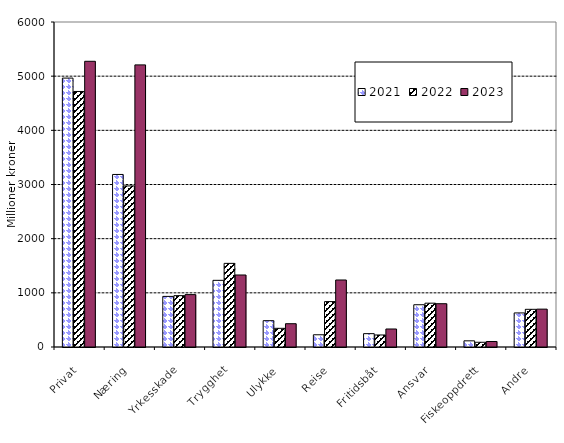
| Category | 2021 | 2022 | 2023 |
|---|---|---|---|
| Privat | 4964.318 | 4717.422 | 5274.66 |
| Næring | 3185.211 | 2973.657 | 5208.194 |
| Yrkesskade | 934.056 | 948.379 | 966.975 |
| Trygghet | 1230.79 | 1543.898 | 1329.46 |
| Ulykke | 485.77 | 344.967 | 430.09 |
| Reise | 225.67 | 838.339 | 1237.122 |
| Fritidsbåt | 246.519 | 222.005 | 332.571 |
| Ansvar | 780.018 | 808.894 | 799.08 |
| Fiskeoppdrett | 113.797 | 87.348 | 101.539 |
| Andre | 628.909 | 695.607 | 699.155 |